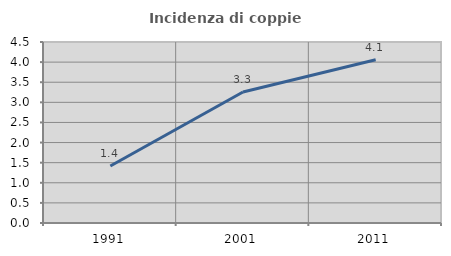
| Category | Incidenza di coppie miste |
|---|---|
| 1991.0 | 1.416 |
| 2001.0 | 3.257 |
| 2011.0 | 4.058 |